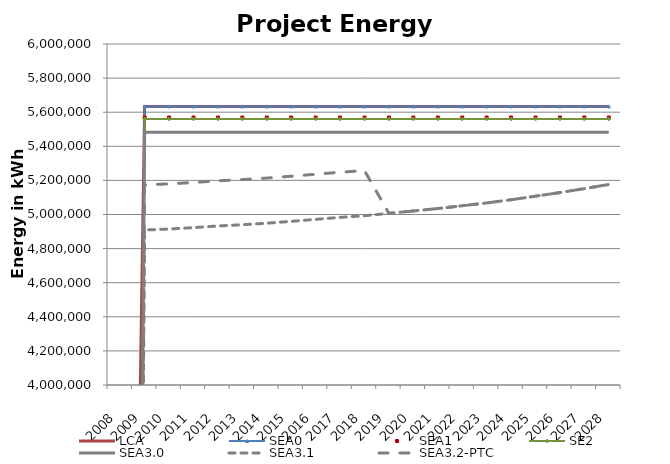
| Category | LCA | SEA0 | SEA1 | SE2 | SEA3.0 | SEA3.1 | SEA3.2-PTC |
|---|---|---|---|---|---|---|---|
| 2008.0 | -3635621.436 | -12732439.771 | -12732439.771 | -12732439.771 | -12732439.771 | -12732439.771 | -12732439.771 |
| 2009.0 | 5634000 | 5634000 | 5568999.544 | 5560561.033 | 5482675.976 | 4908881.649 | 5173662.45 |
| 2010.0 | 5634000 | 5634000 | 5568999.544 | 5560561.033 | 5482675.976 | 4914922.917 | 5179703.718 |
| 2011.0 | 5634000 | 5634000 | 5568999.544 | 5560561.033 | 5482675.976 | 4922867.484 | 5187648.285 |
| 2012.0 | 5634000 | 5634000 | 5568999.544 | 5560561.033 | 5482675.976 | 4932693.596 | 5197474.397 |
| 2013.0 | 5634000 | 5634000 | 5568999.544 | 5560561.033 | 5482675.976 | 4939902.19 | 5204682.99 |
| 2014.0 | 5634000 | 5634000 | 5568999.544 | 5560561.033 | 5482675.976 | 4948944.491 | 5213725.292 |
| 2015.0 | 5634000 | 5634000 | 5568999.544 | 5560561.033 | 5482675.976 | 4959794.224 | 5224575.025 |
| 2016.0 | 5634000 | 5634000 | 5568999.544 | 5560561.033 | 5482675.976 | 4971393.739 | 5236174.54 |
| 2017.0 | 5634000 | 5634000 | 5568999.544 | 5560561.033 | 5482675.976 | 4983129.842 | 5247910.643 |
| 2018.0 | 5634000 | 5634000 | 5568999.544 | 5560561.033 | 5482675.976 | 4992764.584 | 5257545.385 |
| 2019.0 | 5634000 | 5634000 | 5568999.544 | 5560561.033 | 5482675.976 | 5006738.637 | 5006738.637 |
| 2020.0 | 5634000 | 5634000 | 5568999.544 | 5560561.033 | 5482675.976 | 5020849.279 | 5020849.279 |
| 2021.0 | 5634000 | 5634000 | 5568999.544 | 5560561.033 | 5482675.976 | 5034959.92 | 5034959.92 |
| 2022.0 | 5634000 | 5634000 | 5568999.544 | 5560561.033 | 5482675.976 | 5051308.512 | 5051308.512 |
| 2023.0 | 5634000 | 5634000 | 5568999.544 | 5560561.033 | 5482675.976 | 5067793.692 | 5067793.692 |
| 2024.0 | 5634000 | 5634000 | 5568999.544 | 5560561.033 | 5482675.976 | 5086516.822 | 5086516.822 |
| 2025.0 | 5634000 | 5634000 | 5568999.544 | 5560561.033 | 5482675.976 | 5107477.902 | 5107477.902 |
| 2026.0 | 5634000 | 5634000 | 5568999.544 | 5560561.033 | 5482675.976 | 5128575.57 | 5128575.57 |
| 2027.0 | 5634000 | 5634000 | 5568999.544 | 5560561.033 | 5482675.976 | 5151911.188 | 5151911.188 |
| 2028.0 | 5634000 | 5634000 | 5568999.544 | 5560561.033 | 5482675.976 | 5176076.844 | 5176076.844 |